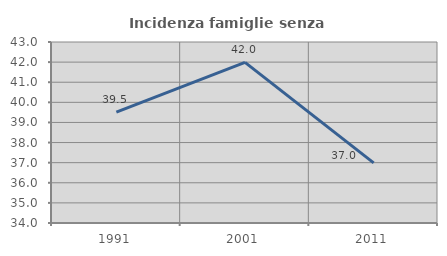
| Category | Incidenza famiglie senza nuclei |
|---|---|
| 1991.0 | 39.516 |
| 2001.0 | 41.985 |
| 2011.0 | 36.986 |